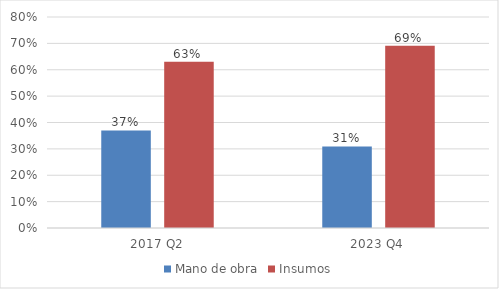
| Category | Mano de obra | Insumos |
|---|---|---|
| 2017 Q2 | 0.37 | 0.63 |
| 2023 Q4 | 0.309 | 0.691 |